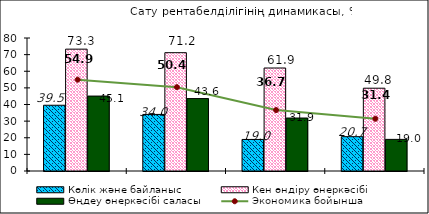
| Category | Көлік және байланыс | Кен өндіру өнеркәсібі | Өңдеу өнеркәсібі саласы |
|---|---|---|---|
| 0 | 39.55 | 73.293 | 45.074 |
| 1 | 34.023 | 71.17 | 43.565 |
| 2 | 18.983 | 61.947 | 31.866 |
| 3 | 20.656 | 49.799 | 19.016 |